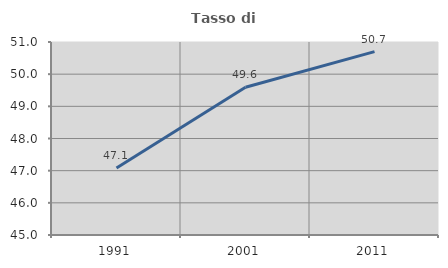
| Category | Tasso di occupazione   |
|---|---|
| 1991.0 | 47.082 |
| 2001.0 | 49.592 |
| 2011.0 | 50.701 |